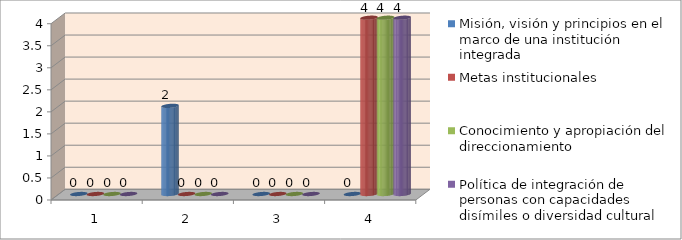
| Category | Misión, visión y principios en el marco de una institución
integrada | Metas institucionales | Conocimiento y apropiación del direccionamiento | Política de integración de
personas con capacidades
disímiles o diversidad cultural |
|---|---|---|---|---|
| 0 | 0 | 0 | 0 | 0 |
| 1 | 2 | 0 | 0 | 0 |
| 2 | 0 | 0 | 0 | 0 |
| 3 | 0 | 4 | 4 | 4 |